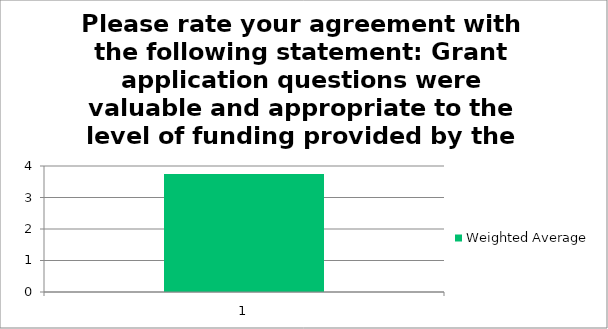
| Category | Weighted Average |
|---|---|
| 1.0 | 3.75 |